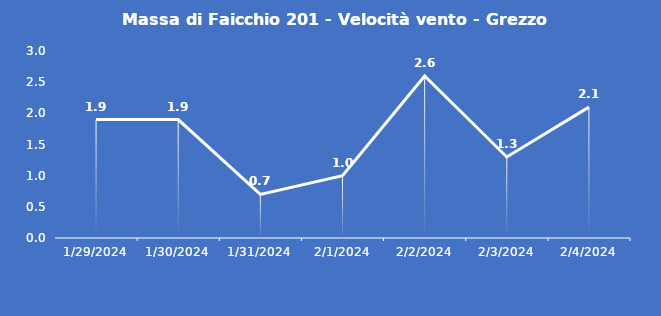
| Category | Massa di Faicchio 201 - Velocità vento - Grezzo (m/s) |
|---|---|
| 1/29/24 | 1.9 |
| 1/30/24 | 1.9 |
| 1/31/24 | 0.7 |
| 2/1/24 | 1 |
| 2/2/24 | 2.6 |
| 2/3/24 | 1.3 |
| 2/4/24 | 2.1 |